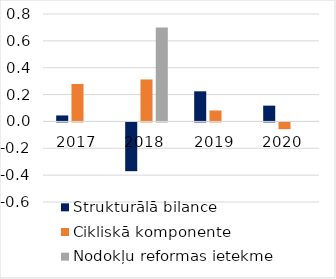
| Category | Strukturālā bilance | Cikliskā komponente | Nodokļu reformas ietekme |
|---|---|---|---|
| 2017.0 | 0.044 | 0.279 | 0 |
| 2018.0 | -0.363 | 0.312 | 0.7 |
| 2019.0 | 0.224 | 0.082 | 0 |
| 2020.0 | 0.118 | -0.05 | 0 |